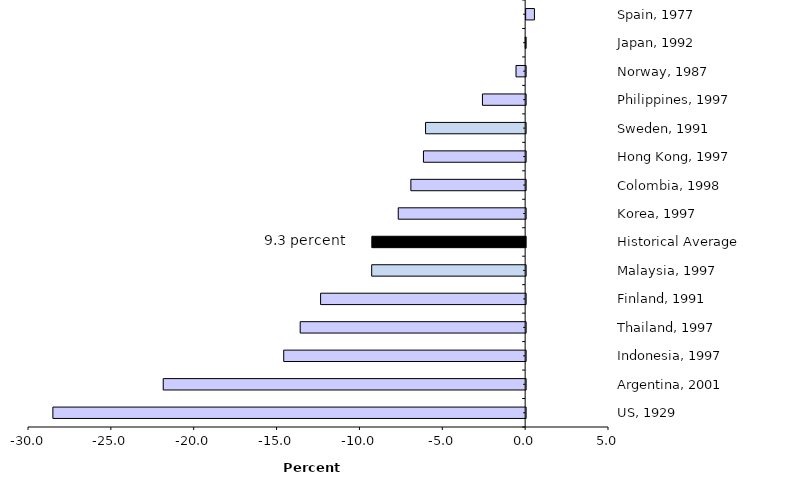
| Category | Series 0 |
|---|---|
| US, 1929 | -28.528 |
| Argentina, 2001 | -21.869 |
| Indonesia, 1997 | -14.599 |
| Thailand, 1997 | -13.604 |
| Finland, 1991 | -12.373 |
| Malaysia, 1997 | -9.29 |
| Historical Average | -9.271 |
| Korea, 1997 | -7.686 |
| Colombia, 1998 | -6.926 |
| Hong Kong, 1997 | -6.166 |
| Sweden, 1991 | -6.04 |
| Philippines, 1997 | -2.606 |
| Norway, 1987 | -0.579 |
| Japan, 1992 | -0.025 |
| Spain, 1977 | 0.5 |